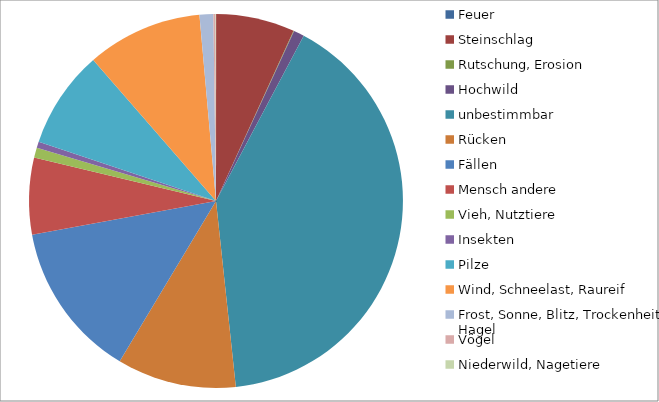
| Category | Anteil |
|---|---|
| Feuer | 0 |
| Steinschlag | 0.015 |
| Rutschung, Erosion | 0 |
| Hochwild | 0.002 |
| unbestimmbar | 0.09 |
| Rücken | 0.023 |
| Fällen | 0.03 |
| Mensch andere | 0.015 |
| Vieh, Nutztiere | 0.002 |
| Insekten | 0.001 |
| Pilze | 0.019 |
| Wind, Schneelast, Raureif | 0.022 |
| Frost, Sonne, Blitz, Trockenheit, Hagel | 0.003 |
| Vögel | 0 |
| Niederwild, Nagetiere | 0 |